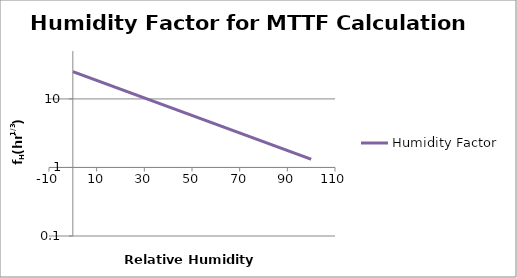
| Category | Humidity Factor |
|---|---|
| 0.0 | 25 |
| 1.0 | 24.275 |
| 2.0 | 23.571 |
| 3.0 | 22.887 |
| 4.0 | 22.224 |
| 5.0 | 21.579 |
| 6.0 | 20.953 |
| 7.0 | 20.346 |
| 8.0 | 19.756 |
| 9.0 | 19.183 |
| 10.0 | 18.627 |
| 11.0 | 18.086 |
| 12.0 | 17.562 |
| 13.0 | 17.053 |
| 14.0 | 16.558 |
| 15.0 | 16.078 |
| 16.0 | 15.612 |
| 17.0 | 15.159 |
| 18.0 | 14.719 |
| 19.0 | 14.292 |
| 20.0 | 13.878 |
| 21.0 | 13.475 |
| 22.0 | 13.085 |
| 23.0 | 12.705 |
| 24.0 | 12.337 |
| 25.0 | 11.979 |
| 26.0 | 11.632 |
| 27.0 | 11.294 |
| 28.0 | 10.967 |
| 29.0 | 10.649 |
| 30.0 | 10.34 |
| 31.0 | 10.04 |
| 32.0 | 9.749 |
| 33.0 | 9.466 |
| 34.0 | 9.192 |
| 35.0 | 8.925 |
| 36.0 | 8.666 |
| 37.0 | 8.415 |
| 38.0 | 8.171 |
| 39.0 | 7.934 |
| 40.0 | 7.704 |
| 41.0 | 7.48 |
| 42.0 | 7.264 |
| 43.0 | 7.053 |
| 44.0 | 6.848 |
| 45.0 | 6.65 |
| 46.0 | 6.457 |
| 47.0 | 6.27 |
| 48.0 | 6.088 |
| 49.0 | 5.911 |
| 50.0 | 5.74 |
| 51.0 | 5.573 |
| 52.0 | 5.412 |
| 53.0 | 5.255 |
| 54.0 | 5.102 |
| 55.0 | 4.954 |
| 56.0 | 4.811 |
| 57.0 | 4.671 |
| 58.0 | 4.536 |
| 59.0 | 4.404 |
| 60.0 | 4.277 |
| 61.0 | 4.153 |
| 62.0 | 4.032 |
| 63.0 | 3.915 |
| 64.0 | 3.802 |
| 65.0 | 3.691 |
| 66.0 | 3.584 |
| 67.0 | 3.48 |
| 68.0 | 3.379 |
| 69.0 | 3.281 |
| 70.0 | 3.186 |
| 71.0 | 3.094 |
| 72.0 | 3.004 |
| 73.0 | 2.917 |
| 74.0 | 2.832 |
| 75.0 | 2.75 |
| 76.0 | 2.671 |
| 77.0 | 2.593 |
| 78.0 | 2.518 |
| 79.0 | 2.445 |
| 80.0 | 2.374 |
| 81.0 | 2.305 |
| 82.0 | 2.238 |
| 83.0 | 2.173 |
| 84.0 | 2.11 |
| 85.0 | 2.049 |
| 86.0 | 1.99 |
| 87.0 | 1.932 |
| 88.0 | 1.876 |
| 89.0 | 1.822 |
| 90.0 | 1.769 |
| 91.0 | 1.717 |
| 92.0 | 1.668 |
| 93.0 | 1.619 |
| 94.0 | 1.572 |
| 95.0 | 1.527 |
| 96.0 | 1.482 |
| 97.0 | 1.439 |
| 98.0 | 1.398 |
| 99.0 | 1.357 |
| 100.0 | 1.318 |